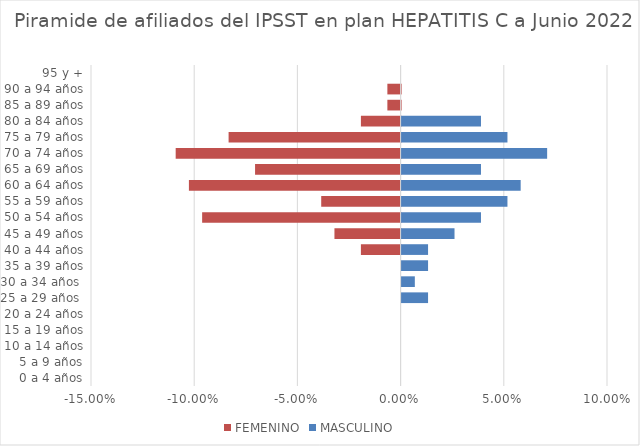
| Category | FEMENINO | MASCULINO |
|---|---|---|
| 0 a 4 años | 0 | 0 |
| 5 a 9 años | 0 | 0 |
| 10 a 14 años | 0 | 0 |
| 15 a 19 años | 0 | 0 |
| 20 a 24 años | 0 | 0 |
| 25 a 29 años  | 0 | 0.013 |
| 30 a 34 años  | 0 | 0.006 |
| 35 a 39 años | 0 | 0.013 |
| 40 a 44 años | -0.019 | 0.013 |
| 45 a 49 años | -0.032 | 0.026 |
| 50 a 54 años | -0.096 | 0.038 |
| 55 a 59 años | -0.038 | 0.051 |
| 60 a 64 años | -0.103 | 0.058 |
| 65 a 69 años | -0.071 | 0.038 |
| 70 a 74 años | -0.109 | 0.071 |
| 75 a 79 años | -0.083 | 0.051 |
| 80 a 84 años | -0.019 | 0.038 |
| 85 a 89 años | -0.006 | 0 |
| 90 a 94 años | -0.006 | 0 |
| 95 y + | 0 | 0 |